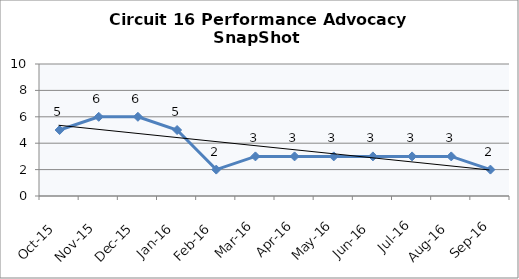
| Category | Circuit 16 |
|---|---|
| Oct-15 | 5 |
| Nov-15 | 6 |
| Dec-15 | 6 |
| Jan-16 | 5 |
| Feb-16 | 2 |
| Mar-16 | 3 |
| Apr-16 | 3 |
| May-16 | 3 |
| Jun-16 | 3 |
| Jul-16 | 3 |
| Aug-16 | 3 |
| Sep-16 | 2 |